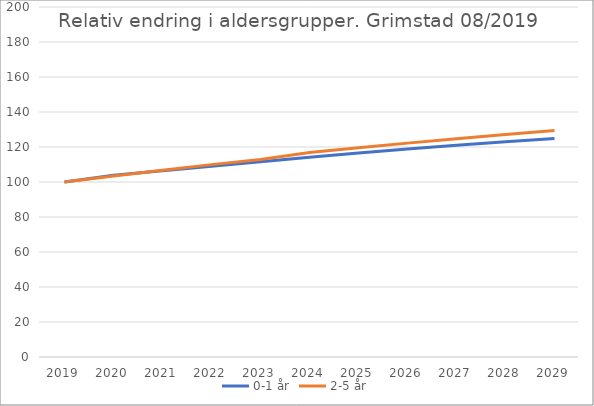
| Category | 0-1 år | 2-5 år |
|---|---|---|
| 2019 | 100 | 100 |
| 2020 | 103.873 | 103.378 |
| 2021 | 106.441 | 106.734 |
| 2022 | 109.012 | 109.924 |
| 2023 | 111.624 | 112.8 |
| 2024 | 114.172 | 116.817 |
| 2025 | 116.6 | 119.545 |
| 2026 | 118.892 | 122.212 |
| 2027 | 121.048 | 124.781 |
| 2028 | 123.056 | 127.197 |
| 2029 | 124.917 | 129.435 |